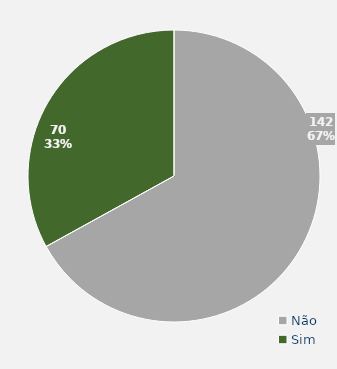
| Category | Total |
|---|---|
| Não | 142 |
| Sim | 70 |